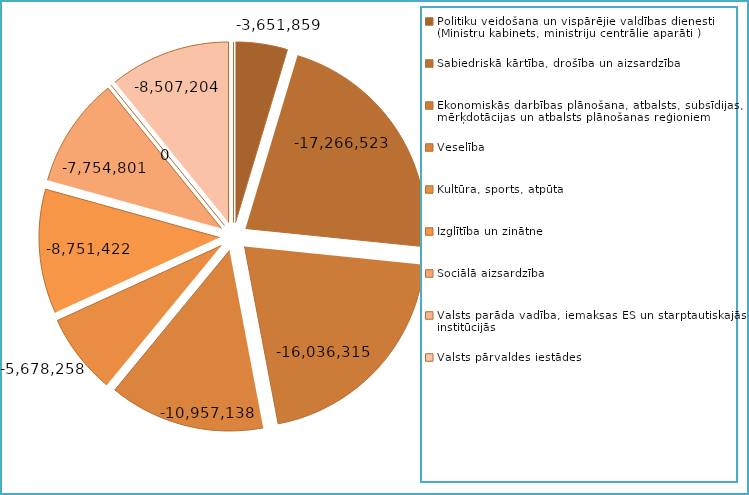
| Category | Series 0 |
|---|---|
| Politiku veidošana un vispārējie valdības dienesti (Ministru kabinets, ministriju centrālie aparāti ) | -3651859.27 |
| Sabiedriskā kārtība, drošība un aizsardzība | -17266522.88 |
| Ekonomiskās darbības plānošana, atbalsts, subsīdijas, mērķdotācijas un atbalsts plānošanas reģioniem | -16036314.773 |
| Veselība | -10957138.359 |
| Kultūra, sports, atpūta | -5678257.985 |
| Izglītība un zinātne | -8751422.212 |
| Sociālā aizsardzība | -7754801.213 |
| Valsts parāda vadība, iemaksas ES un starptautiskajās institūcijās | 0 |
| Valsts pārvaldes iestādes | -8507203.956 |
| Ar ārvalstu finanšu palīdzību saistīti izdevumi | 0 |
| Neatkarīgās iestādes | 0 |